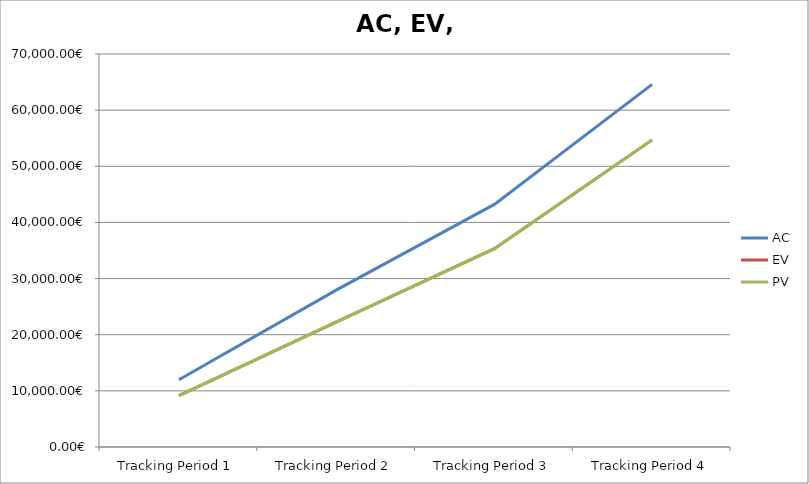
| Category | AC | EV | PV |
|---|---|---|---|
| Tracking Period 1 | 11980.99 | 9153.99 | 9153.99 |
| Tracking Period 2 | 27991.05 | 22305.05 | 22305.05 |
| Tracking Period 3 | 43209.54 | 35324.54 | 35324.54 |
| Tracking Period 4 | 64580.17 | 54703.17 | 54703.17 |